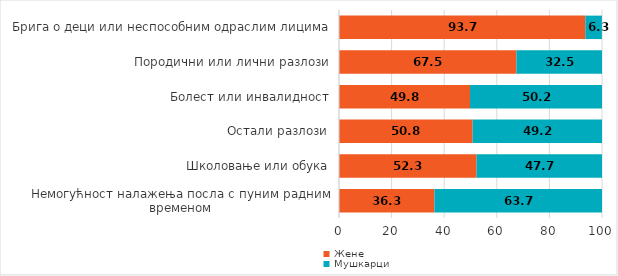
| Category | Жене | Мушкарци |
|---|---|---|
| Немогућност налажења посла с пуним радним временом | 36.27 | 63.73 |
| Школовање или обука | 52.305 | 47.695 |
| Остали разлози | 50.81 | 49.19 |
| Болест или инвалидност | 49.818 | 50.182 |
| Породични или лични разлози | 67.45 | 32.55 |
| Брига о деци или неспособним одраслим лицима | 93.668 | 6.3 |